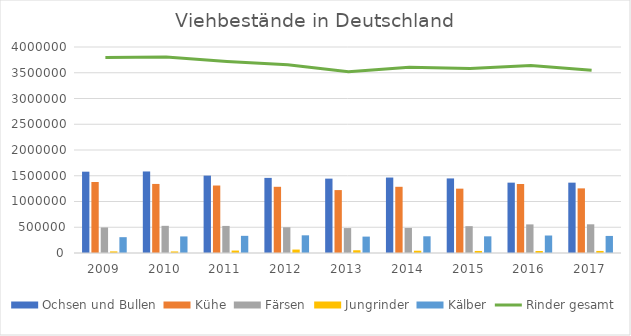
| Category | Ochsen und Bullen | Kühe | Färsen | Jungrinder | Kälber |
|---|---|---|---|---|---|
| 2009.0 | 1578983 | 1378951 | 495561 | 31366 | 307258 |
| 2010.0 | 1583245 | 1340955 | 527639 | 30266 | 321708 |
| 2011.0 | 1502384 | 1310343 | 525661 | 47305 | 333320 |
| 2012.0 | 1458546 | 1285572 | 499409 | 66873 | 343386 |
| 2013.0 | 1444136 | 1221705 | 484152 | 53131 | 318448 |
| 2014.0 | 1465046 | 1285466 | 487309 | 44223 | 324399 |
| 2015.0 | 1448025 | 1249346 | 521133 | 39890 | 323559 |
| 2016.0 | 1366115 | 1339922 | 555570 | 38875 | 339588 |
| 2017.0 | 1365931 | 1254820 | 557274 | 40089 | 331318 |